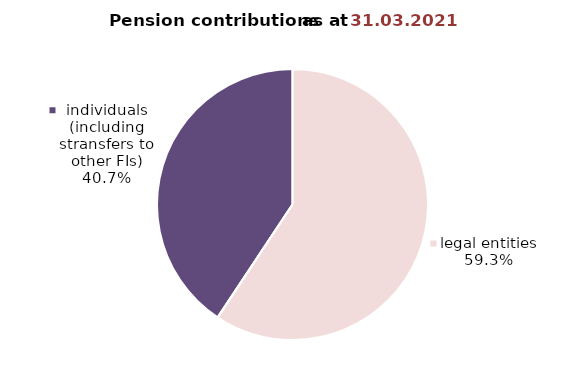
| Category | Series 0 |
|---|---|
| legal entities | 851.175 |
| private entrepreneurs (FOPs) | 0.27 |
| individuals (including stransfers to other FIs) | 583.869 |